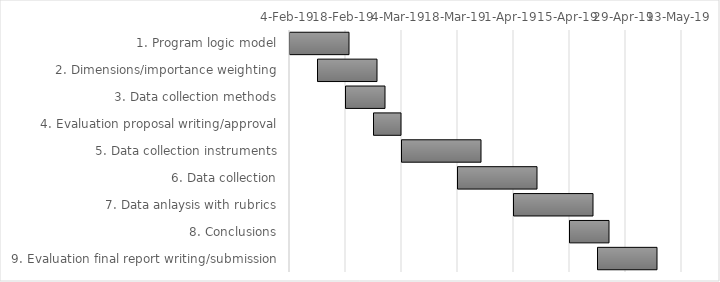
| Category | Start Date | Duration (Days) |
|---|---|---|
| 1. Program logic model | 2019-02-04 | 15 |
| 2. Dimensions/importance weighting | 2019-02-11 | 15 |
| 3. Data collection methods | 2019-02-18 | 10 |
| 4. Evaluation proposal writing/approval | 2019-02-25 | 7 |
| 5. Data collection instruments | 2019-03-04 | 20 |
| 6. Data collection | 2019-03-18 | 20 |
| 7. Data anlaysis with rubrics | 2019-04-01 | 20 |
| 8. Conclusions | 2019-04-15 | 10 |
| 9. Evaluation final report writing/submission | 2019-04-22 | 15 |